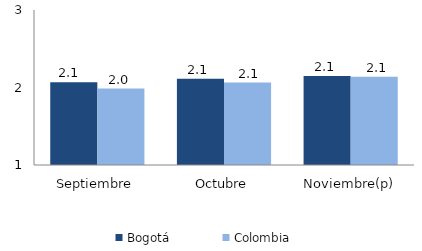
| Category | Bogotá | Colombia |
|---|---|---|
| Septiembre | 2.068 | 1.987 |
| Octubre | 2.114 | 2.063 |
| Noviembre(p) | 2.149 | 2.139 |